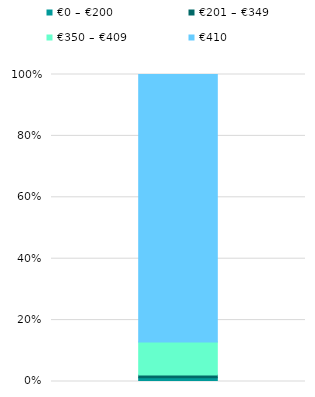
| Category | €0 – €200 | €201 – €349 | €350 – €409 | €410 |
|---|---|---|---|---|
| 0 | 0.012 | 0.009 | 0.108 | 0.871 |